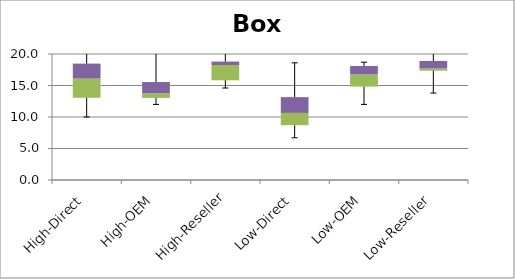
| Category | Min | Q1-Min | Med-Q1 | Q3-Med |
|---|---|---|---|---|
| High-Direct | 10 | 3.05 | 3.05 | 2.375 |
| High-OEM | 12 | 1.025 | 0.725 | 1.8 |
| High-Reseller | 14.6 | 1.225 | 2.425 | 0.55 |
| Low-Direct | 6.7 | 2 | 1.95 | 2.5 |
| Low-OEM | 12 | 2.825 | 1.925 | 1.35 |
| Low-Reseller | 13.8 | 3.55 | 0.35 | 1.2 |